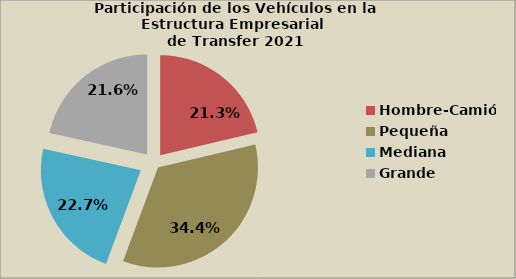
| Category | Series 0 |
|---|---|
| Hombre-Camión | 21.308 |
| Pequeña | 34.367 |
| Mediana | 22.747 |
| Grande | 21.578 |